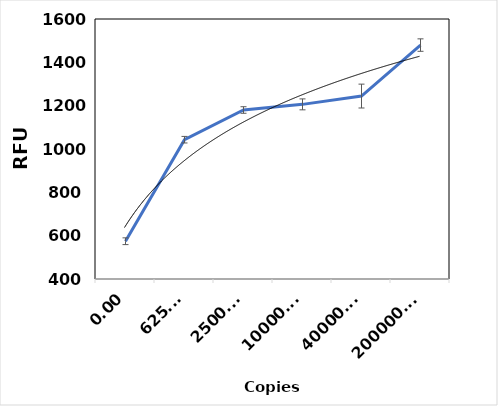
| Category | AFU_N1 primer set |
|---|---|
| 0.0 | 574.333 |
| 625.0 | 1043 |
| 2500.0 | 1180 |
| 10000.0 | 1206 |
| 40000.0 | 1244.333 |
| 200000.0 | 1479.667 |